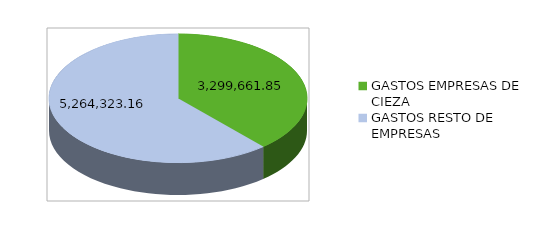
| Category | Series 0 |
|---|---|
| GASTOS EMPRESAS DE CIEZA | 3299661.85 |
| GASTOS RESTO DE EMPRESAS | 5264323.16 |